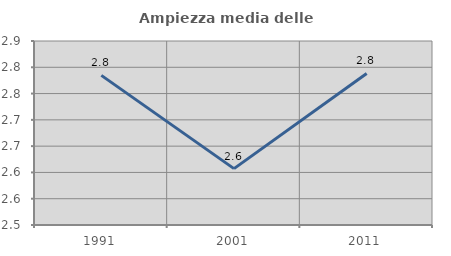
| Category | Ampiezza media delle famiglie |
|---|---|
| 1991.0 | 2.785 |
| 2001.0 | 2.607 |
| 2011.0 | 2.788 |